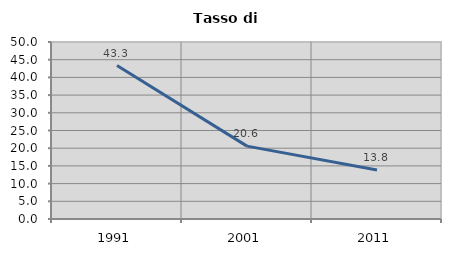
| Category | Tasso di disoccupazione   |
|---|---|
| 1991.0 | 43.349 |
| 2001.0 | 20.588 |
| 2011.0 | 13.817 |